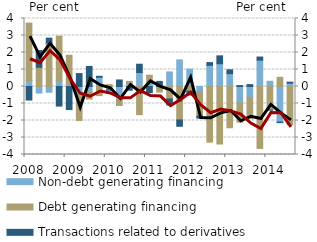
| Category | Non-debt generating financing | Debt generating financing | Transactions related to derivatives |
|---|---|---|---|
| 2008.0 | 0.348 | 3.381 | -0.797 |
| 2008.0 | -0.385 | 1.131 | 0.986 |
| 2008.0 | -0.338 | 2.551 | 0.292 |
| 2008.0 | 0.334 | 2.628 | -1.152 |
| 2009.0 | 0.125 | 1.714 | -1.358 |
| 2009.0 | -0.495 | -1.502 | 0.758 |
| 2009.0 | -0.31 | -0.426 | 1.181 |
| 2009.0 | 0.54 | -0.537 | 0.06 |
| 2010.0 | -0.188 | 0.108 | -0.028 |
| 2010.0 | -0.819 | -0.301 | 0.384 |
| 2010.0 | 0.167 | 0.134 | -0.216 |
| 2010.0 | 0.825 | -1.656 | 0.485 |
| 2011.0 | 0.28 | 0.384 | -0.362 |
| 2011.0 | -0.045 | -0.279 | 0.301 |
| 2011.0 | 0.858 | -0.734 | -0.355 |
| 2011.0 | 1.566 | -1.967 | -0.372 |
| 2012.0 | 1.021 | -0.271 | -0.233 |
| 2012.0 | -0.32 | -1.424 | -0.117 |
| 2012.0 | 1.246 | -3.273 | 0.16 |
| 2012.0 | 1.341 | -3.383 | 0.463 |
| 2013.0 | 0.755 | -2.426 | 0.228 |
| 2013.0 | -0.965 | -1.135 | 0.053 |
| 2013.0 | -0.64 | -1.251 | 0.112 |
| 2013.0 | 1.548 | -3.643 | 0.185 |
| 2014.0 | 0.307 | -1.378 | -0.016 |
| 2014.0 | -2.092 | 0.54 | -0.034 |
| 2014.0 | 0.197 | -2.248 | 0.059 |